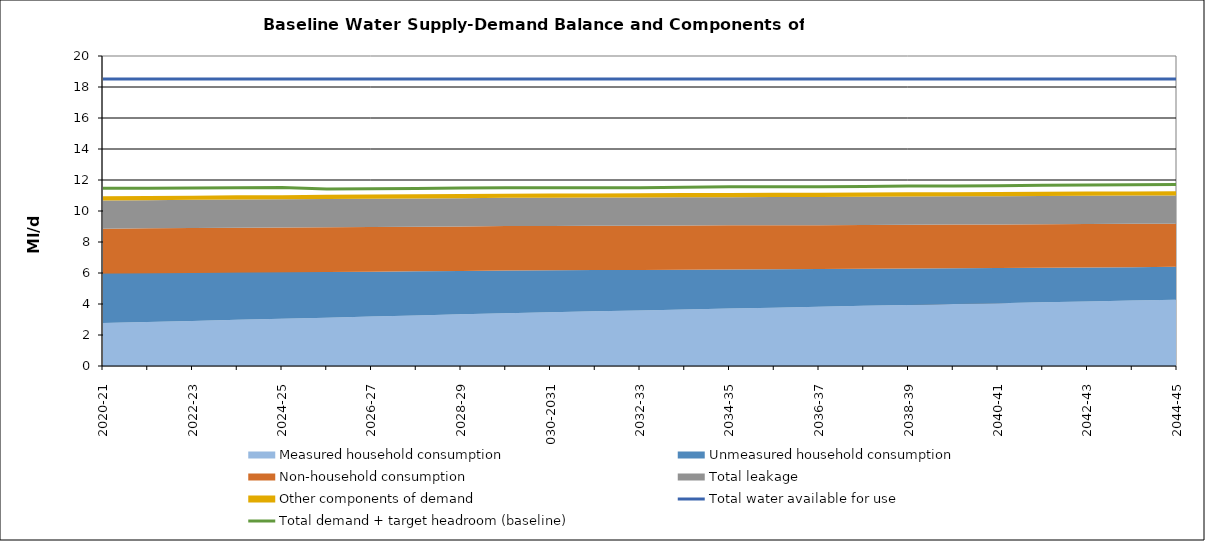
| Category | Total water available for use | Total demand + target headroom (baseline) |
|---|---|---|
| 0 | 18.524 | 11.464 |
| 1 | 18.524 | 11.474 |
| 2 | 18.524 | 11.49 |
| 3 | 18.524 | 11.506 |
| 4 | 18.524 | 11.508 |
| 5 | 18.524 | 11.424 |
| 6 | 18.524 | 11.432 |
| 7 | 18.524 | 11.451 |
| 8 | 18.524 | 11.477 |
| 9 | 18.524 | 11.5 |
| 10 | 18.524 | 11.504 |
| 11 | 18.524 | 11.506 |
| 12 | 18.524 | 11.506 |
| 13 | 18.524 | 11.536 |
| 14 | 18.524 | 11.558 |
| 15 | 18.524 | 11.561 |
| 16 | 18.524 | 11.57 |
| 17 | 18.524 | 11.581 |
| 18 | 18.524 | 11.607 |
| 19 | 18.524 | 11.612 |
| 20 | 18.524 | 11.625 |
| 21 | 18.524 | 11.666 |
| 22 | 18.524 | 11.68 |
| 23 | 18.524 | 11.695 |
| 24 | 18.524 | 11.71 |